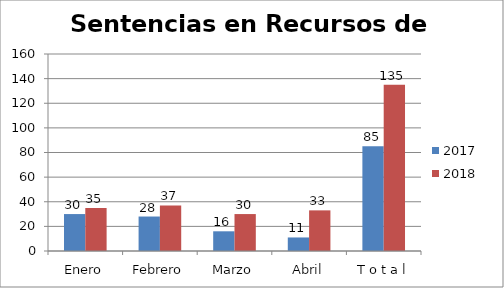
| Category | 2017 | 2018 |
|---|---|---|
| Enero | 30 | 35 |
| Febrero | 28 | 37 |
| Marzo | 16 | 30 |
| Abril | 11 | 33 |
| T o t a l | 85 | 135 |